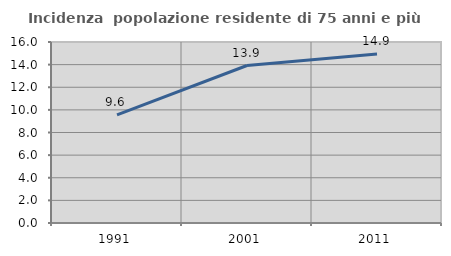
| Category | Incidenza  popolazione residente di 75 anni e più |
|---|---|
| 1991.0 | 9.556 |
| 2001.0 | 13.922 |
| 2011.0 | 14.945 |